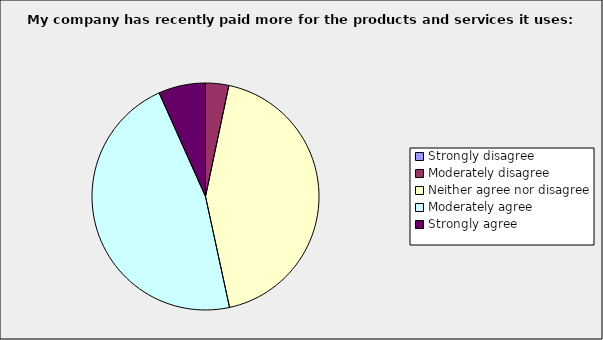
| Category | Series 0 |
|---|---|
| Strongly disagree | 0 |
| Moderately disagree | 0.033 |
| Neither agree nor disagree | 0.433 |
| Moderately agree | 0.467 |
| Strongly agree | 0.067 |